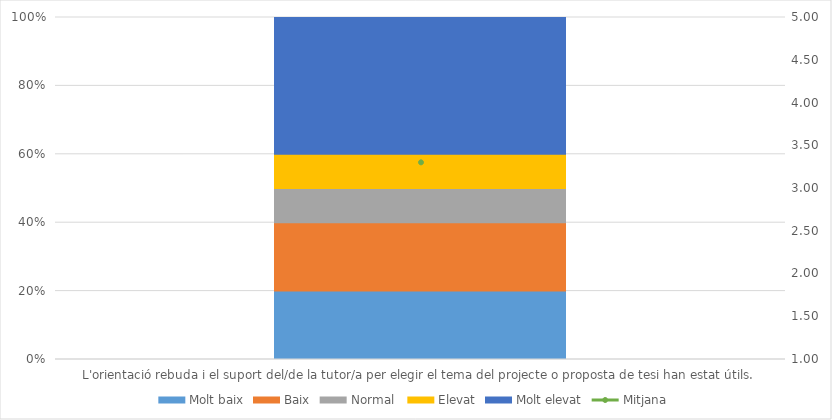
| Category | Molt baix | Baix | Normal  | Elevat | Molt elevat |
|---|---|---|---|---|---|
| L'orientació rebuda i el suport del/de la tutor/a per elegir el tema del projecte o proposta de tesi han estat útils. | 2 | 2 | 1 | 1 | 4 |